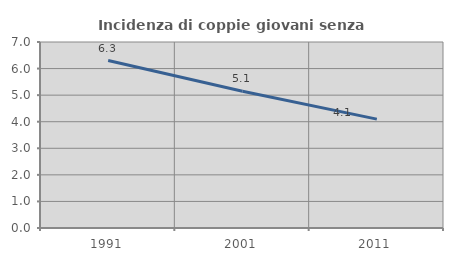
| Category | Incidenza di coppie giovani senza figli |
|---|---|
| 1991.0 | 6.301 |
| 2001.0 | 5.149 |
| 2011.0 | 4.098 |